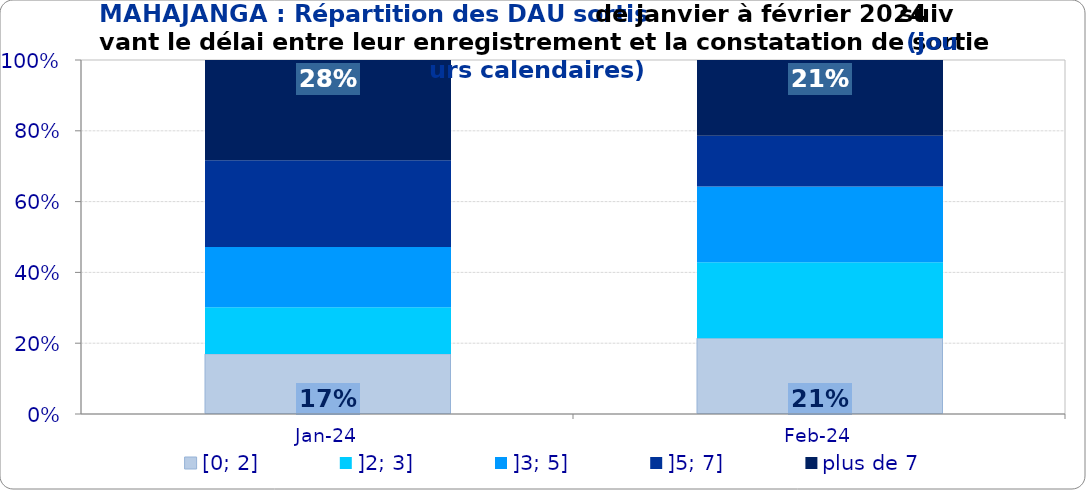
| Category | [0; 2] | ]2; 3] | ]3; 5] | ]5; 7] | plus de 7 |
|---|---|---|---|---|---|
| 2024-01-01 | 0.17 | 0.132 | 0.17 | 0.245 | 0.283 |
| 2024-02-01 | 0.214 | 0.214 | 0.214 | 0.143 | 0.214 |